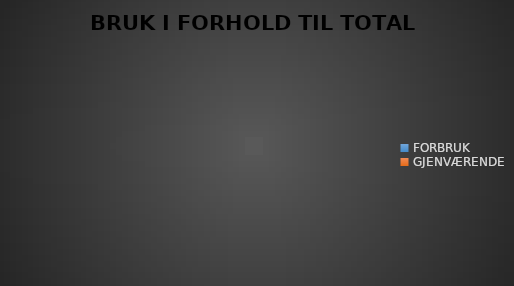
| Category | BRUKT I FORHOLD TIL TOTAL PROGRAMRAMME |
|---|---|
| FORBRUK | 0 |
| GJENVÆRENDE | 0 |